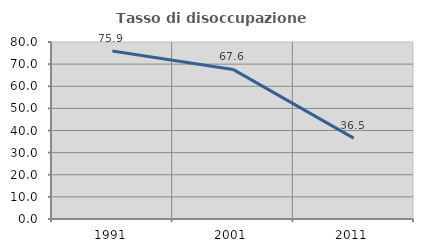
| Category | Tasso di disoccupazione giovanile  |
|---|---|
| 1991.0 | 75.916 |
| 2001.0 | 67.606 |
| 2011.0 | 36.538 |